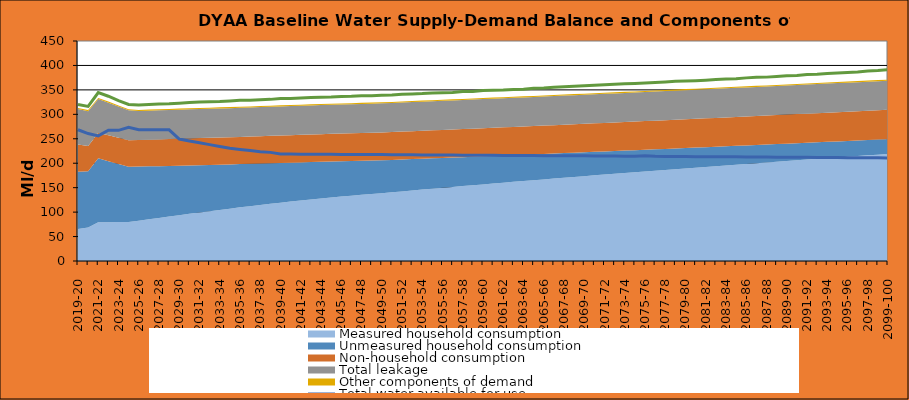
| Category | Total water available for use | Total demand + target headroom (baseline) |
|---|---|---|
| 0 | 268.41 | 320.13 |
| 1 | 260.68 | 316.18 |
| 2 | 255.96 | 344.587 |
| 3 | 267.55 | 337.05 |
| 4 | 267.26 | 328.112 |
| 5 | 273.32 | 320.243 |
| 6 | 268.57 | 319.025 |
| 7 | 268.46 | 320.081 |
| 8 | 268.35 | 321.241 |
| 9 | 268.24 | 321.753 |
| 10 | 249.35 | 322.77 |
| 11 | 245.568 | 324.177 |
| 12 | 241.786 | 325.002 |
| 13 | 238.014 | 325.591 |
| 14 | 234.232 | 326.189 |
| 15 | 230.45 | 327.521 |
| 16 | 228.138 | 328.888 |
| 17 | 225.826 | 329.022 |
| 18 | 223.514 | 329.979 |
| 19 | 222.202 | 330.601 |
| 20 | 218.89 | 332.42 |
| 21 | 218.74 | 332.245 |
| 22 | 218.6 | 333.442 |
| 23 | 218.45 | 334.32 |
| 24 | 218.31 | 334.898 |
| 25 | 218.16 | 335.292 |
| 26 | 218.05 | 336.543 |
| 27 | 217.94 | 336.795 |
| 28 | 217.83 | 337.788 |
| 29 | 217.72 | 338.114 |
| 30 | 217.61 | 339.021 |
| 31 | 217.46 | 339.633 |
| 32 | 217.32 | 340.948 |
| 33 | 217.17 | 341.787 |
| 34 | 217.03 | 342.549 |
| 35 | 216.82 | 343.864 |
| 36 | 216.77 | 344.243 |
| 37 | 216.66 | 344.445 |
| 38 | 216.55 | 346.501 |
| 39 | 216.44 | 346.76 |
| 40 | 216.33 | 348.842 |
| 41 | 216.18 | 349.408 |
| 42 | 216.04 | 349.877 |
| 43 | 215.89 | 350.828 |
| 44 | 215.75 | 351.553 |
| 45 | 215.6 | 353.461 |
| 46 | 215.49 | 353.942 |
| 47 | 215.38 | 355.455 |
| 48 | 215.28 | 356.232 |
| 49 | 215.17 | 357.251 |
| 50 | 215.06 | 358.584 |
| 51 | 214.91 | 359.279 |
| 52 | 214.77 | 360.307 |
| 53 | 214.62 | 361.438 |
| 54 | 214.48 | 362.572 |
| 55 | 214.33 | 363.239 |
| 56 | 215.18 | 364.209 |
| 57 | 214.04 | 365.282 |
| 58 | 213.89 | 366.338 |
| 59 | 213.75 | 367.577 |
| 60 | 213.6 | 368.018 |
| 61 | 213.49 | 368.913 |
| 62 | 213.38 | 369.96 |
| 63 | 213.27 | 371.291 |
| 64 | 213.16 | 372.224 |
| 65 | 213.05 | 372.681 |
| 66 | 212.9 | 374.58 |
| 67 | 212.76 | 375.912 |
| 68 | 212.61 | 376.107 |
| 69 | 212.47 | 377.515 |
| 70 | 212.32 | 378.727 |
| 71 | 212.17 | 379.581 |
| 72 | 212.03 | 381.528 |
| 73 | 211.88 | 382.108 |
| 74 | 211.74 | 383.68 |
| 75 | 211.59 | 384.636 |
| 76 | 211.44 | 385.445 |
| 77 | 211.3 | 386.557 |
| 78 | 211.15 | 388.562 |
| 79 | 211.01 | 389.44 |
| 80 | 210.86 | 391.12 |